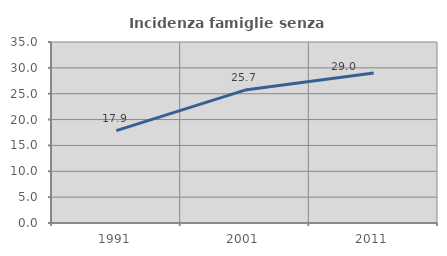
| Category | Incidenza famiglie senza nuclei |
|---|---|
| 1991.0 | 17.857 |
| 2001.0 | 25.701 |
| 2011.0 | 28.992 |